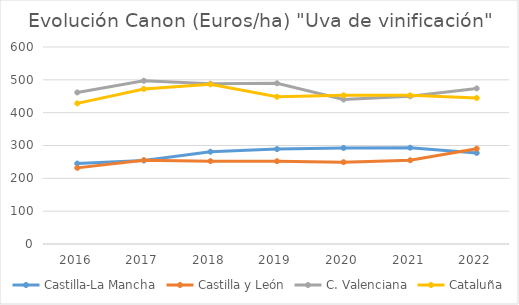
| Category | Castilla-La Mancha | Castilla y León | C. Valenciana | Cataluña |
|---|---|---|---|---|
| 2016.0 | 245.107 | 231.841 | 461.57 | 428.284 |
| 2017.0 | 254.325 | 255.336 | 497.16 | 472.209 |
| 2018.0 | 281.017 | 252.342 | 488 | 486.374 |
| 2019.0 | 289.102 | 252.08 | 489.37 | 448.313 |
| 2020.0 | 292.438 | 249.127 | 440 | 452.842 |
| 2021.0 | 293.31 | 255.107 | 450 | 452.777 |
| 2022.0 | 277.376 | 290.413 | 473.79 | 444.781 |